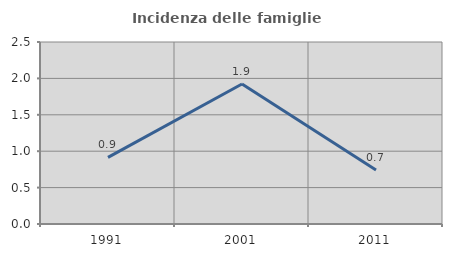
| Category | Incidenza delle famiglie numerose |
|---|---|
| 1991.0 | 0.915 |
| 2001.0 | 1.923 |
| 2011.0 | 0.743 |